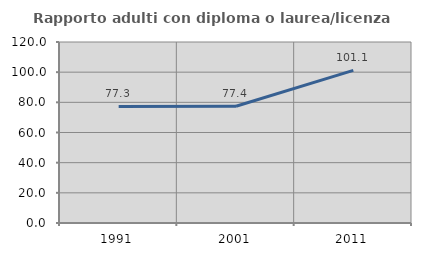
| Category | Rapporto adulti con diploma o laurea/licenza media  |
|---|---|
| 1991.0 | 77.273 |
| 2001.0 | 77.439 |
| 2011.0 | 101.149 |